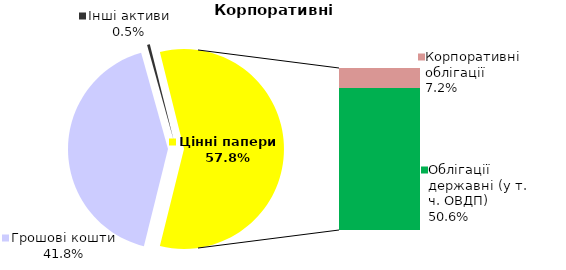
| Category | Корпоративні |
|---|---|
| Грошові кошти | 1.718 |
| Банківські метали | 0 |
| Нерухомість | 0 |
| Інші активи | 0.019 |
| Акції | 0 |
| Корпоративні облігації | 0.294 |
| Облігації місцевих рад | 0 |
| Облігації державні (у т. ч. ОВДП) | 2.08 |